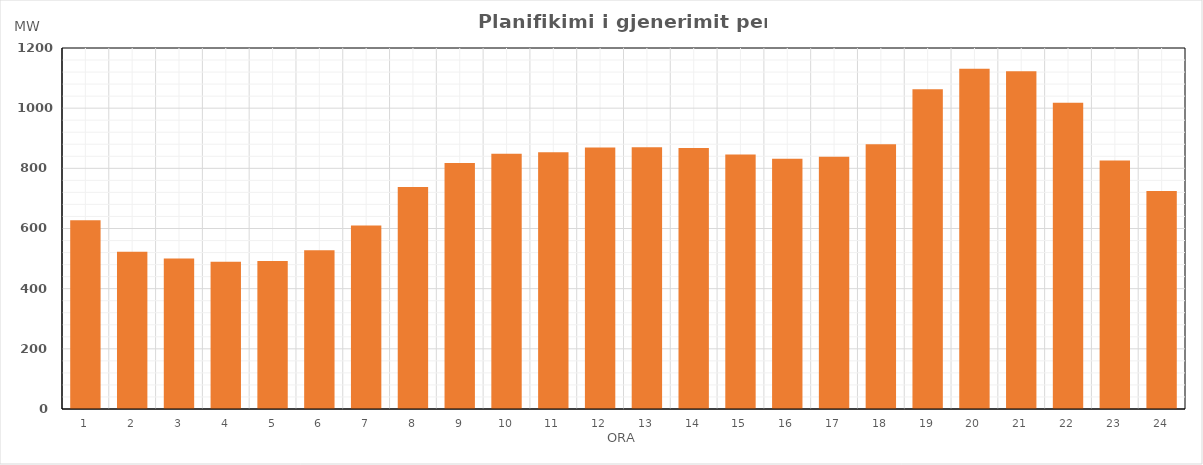
| Category | Max (MW) |
|---|---|
| 0 | 627.18 |
| 1 | 522.89 |
| 2 | 500.42 |
| 3 | 489.63 |
| 4 | 491.79 |
| 5 | 527.91 |
| 6 | 609.96 |
| 7 | 738.05 |
| 8 | 818.1 |
| 9 | 848.71 |
| 10 | 853.33 |
| 11 | 868.95 |
| 12 | 869.9 |
| 13 | 868 |
| 14 | 845.91 |
| 15 | 831.91 |
| 16 | 838.9 |
| 17 | 879.96 |
| 18 | 1062.55 |
| 19 | 1130.84 |
| 20 | 1122.68 |
| 21 | 1018.17 |
| 22 | 825.81 |
| 23 | 724.97 |